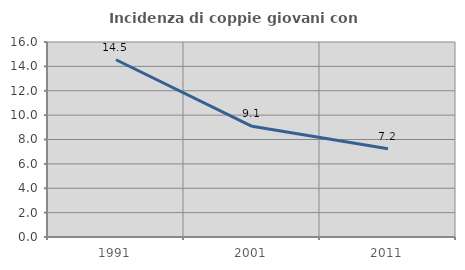
| Category | Incidenza di coppie giovani con figli |
|---|---|
| 1991.0 | 14.543 |
| 2001.0 | 9.084 |
| 2011.0 | 7.24 |